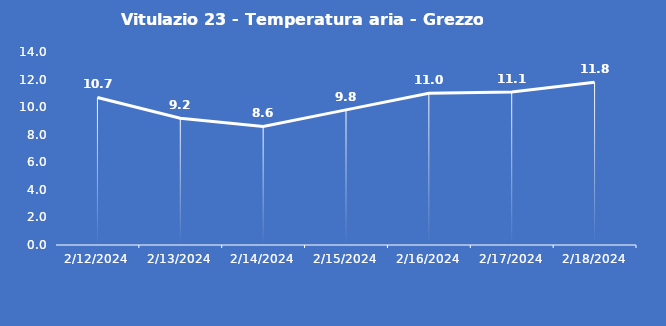
| Category | Vitulazio 23 - Temperatura aria - Grezzo (°C) |
|---|---|
| 2/12/24 | 10.7 |
| 2/13/24 | 9.2 |
| 2/14/24 | 8.6 |
| 2/15/24 | 9.8 |
| 2/16/24 | 11 |
| 2/17/24 | 11.1 |
| 2/18/24 | 11.8 |